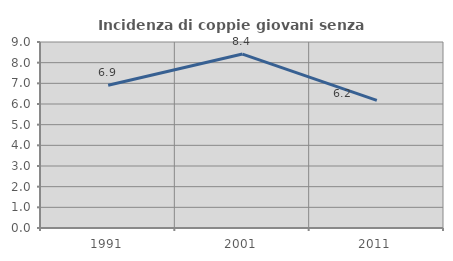
| Category | Incidenza di coppie giovani senza figli |
|---|---|
| 1991.0 | 6.906 |
| 2001.0 | 8.415 |
| 2011.0 | 6.177 |